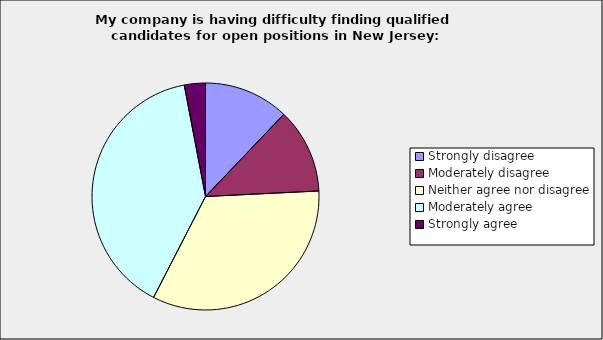
| Category | Series 0 |
|---|---|
| Strongly disagree | 0.121 |
| Moderately disagree | 0.121 |
| Neither agree nor disagree | 0.333 |
| Moderately agree | 0.394 |
| Strongly agree | 0.03 |